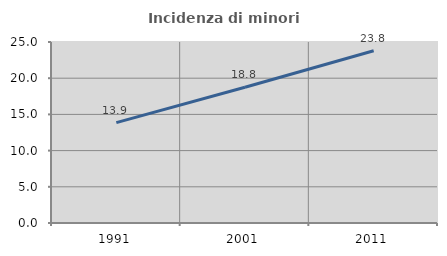
| Category | Incidenza di minori stranieri |
|---|---|
| 1991.0 | 13.861 |
| 2001.0 | 18.75 |
| 2011.0 | 23.8 |